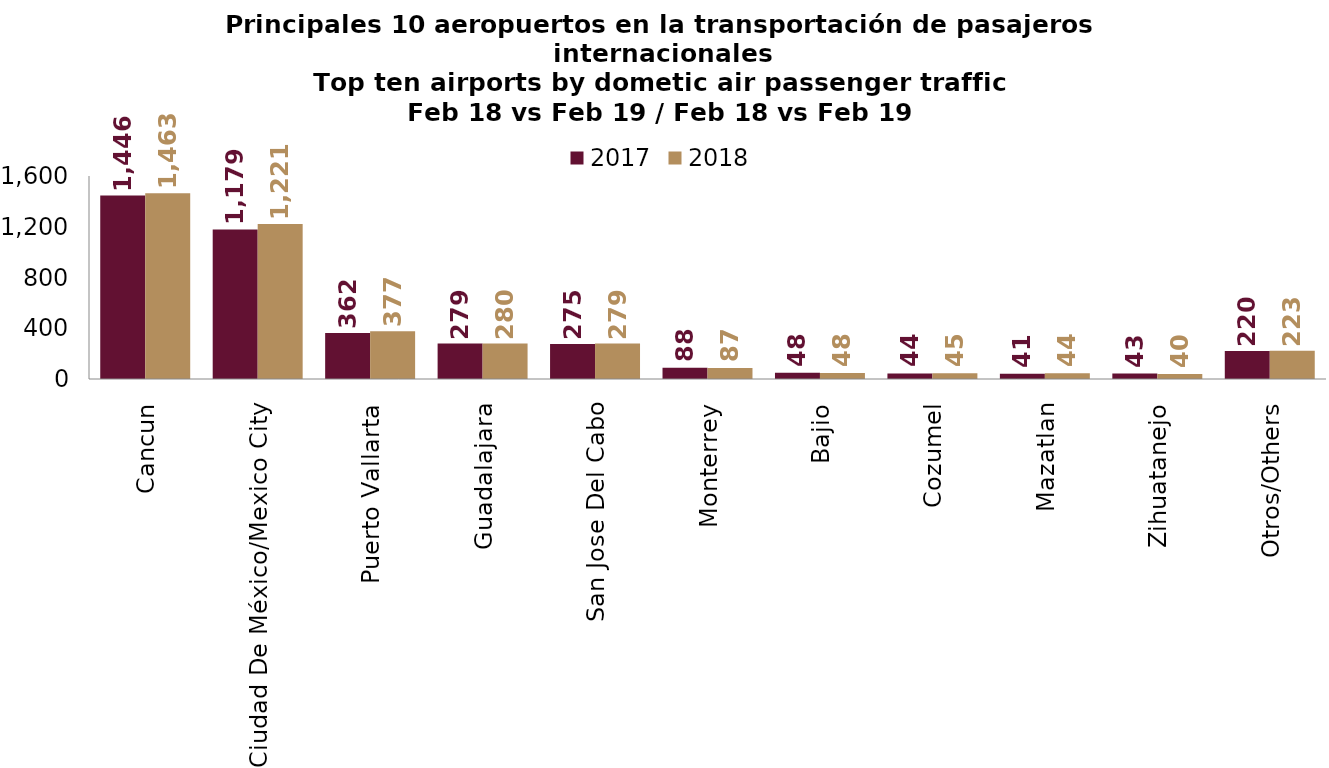
| Category | 2017 | 2018 |
|---|---|---|
| Cancun | 1445.502 | 1463.274 |
| Ciudad De México/Mexico City | 1178.773 | 1220.756 |
| Puerto Vallarta | 361.87 | 376.593 |
| Guadalajara | 279.095 | 279.655 |
| San Jose Del Cabo | 275.206 | 279.025 |
| Monterrey | 88.165 | 87.331 |
| Bajio | 48.345 | 48.039 |
| Cozumel | 43.891 | 44.936 |
| Mazatlan | 41.413 | 44.435 |
| Zihuatanejo | 42.867 | 39.616 |
| Otros/Others | 220.473 | 222.562 |